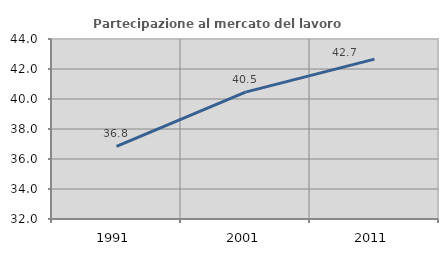
| Category | Partecipazione al mercato del lavoro  femminile |
|---|---|
| 1991.0 | 36.838 |
| 2001.0 | 40.458 |
| 2011.0 | 42.658 |